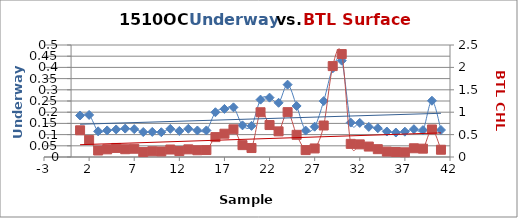
| Category |  FL |
|---|---|
| 0 | 0.185 |
| 1 | 0.188 |
| 2 | 0.115 |
| 3 | 0.119 |
| 4 | 0.123 |
| 5 | 0.127 |
| 6 | 0.124 |
| 7 | 0.112 |
| 8 | 0.112 |
| 9 | 0.111 |
| 10 | 0.125 |
| 11 | 0.116 |
| 12 | 0.126 |
| 13 | 0.118 |
| 14 | 0.119 |
| 15 | 0.2 |
| 16 | 0.215 |
| 17 | 0.222 |
| 18 | 0.141 |
| 19 | 0.139 |
| 20 | 0.256 |
| 21 | 0.265 |
| 22 | 0.242 |
| 23 | 0.323 |
| 24 | 0.228 |
| 25 | 0.118 |
| 26 | 0.135 |
| 27 | 0.25 |
| 28 | 0.396 |
| 29 | 0.43 |
| 30 | 0.154 |
| 31 | 0.152 |
| 32 | 0.134 |
| 33 | 0.129 |
| 34 | 0.114 |
| 35 | 0.109 |
| 36 | 0.113 |
| 37 | 0.124 |
| 38 | 0.12 |
| 39 | 0.251 |
| 40 | 0.12 |